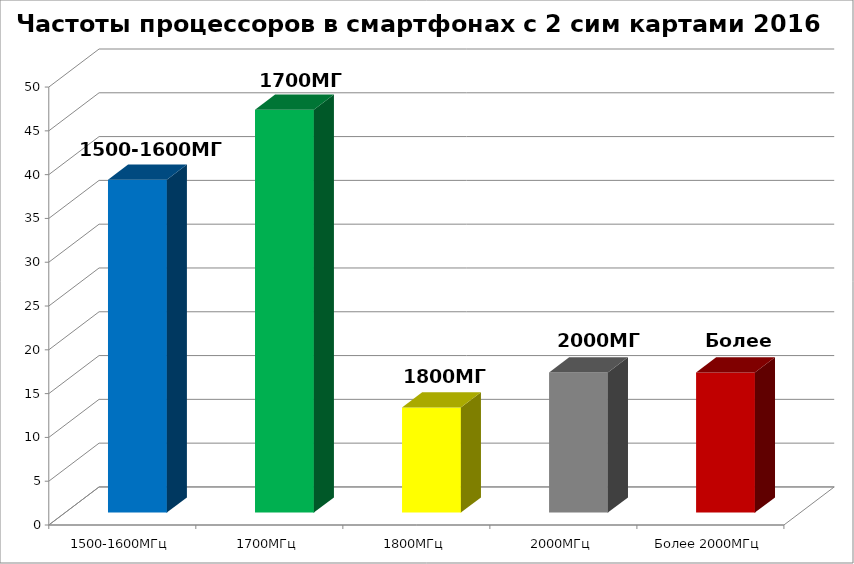
| Category | Series 0 |
|---|---|
| 1500-1600МГц | 38 |
| 1700МГц | 46 |
| 1800МГц | 12 |
| 2000МГц | 16 |
| Более 2000МГц | 16 |